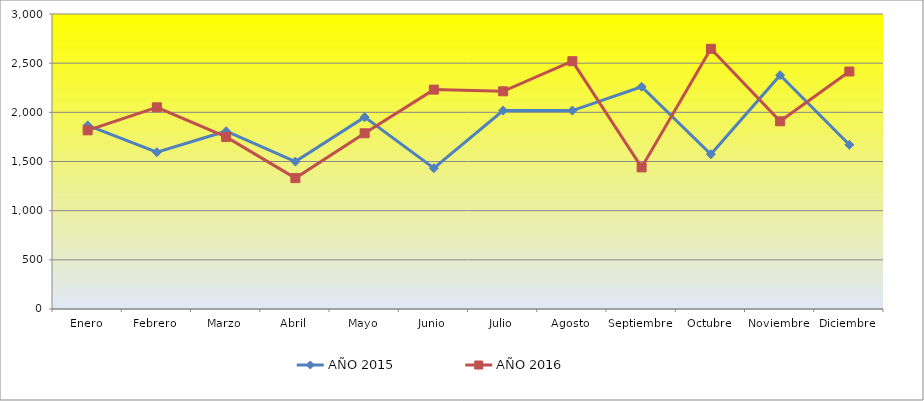
| Category | AÑO 2015 | AÑO 2016 |
|---|---|---|
| Enero | 1867 | 1817 |
| Febrero | 1595 | 2051 |
| Marzo | 1808 | 1750 |
| Abril | 1499 | 1331 |
| Mayo | 1951 | 1787 |
| Junio | 1432 | 2231 |
| Julio | 2018 | 2214 |
| Agosto | 2018 | 2520 |
| Septiembre | 2260 | 1440 |
| Octubre | 1574 | 2646 |
| Noviembre | 2378 | 1909 |
| Diciembre | 1670 | 2415 |